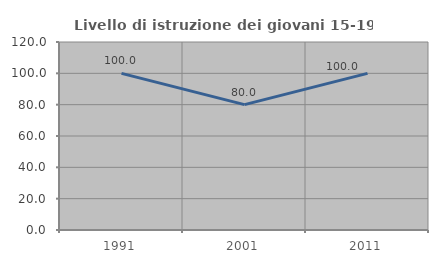
| Category | Livello di istruzione dei giovani 15-19 anni |
|---|---|
| 1991.0 | 100 |
| 2001.0 | 80 |
| 2011.0 | 100 |